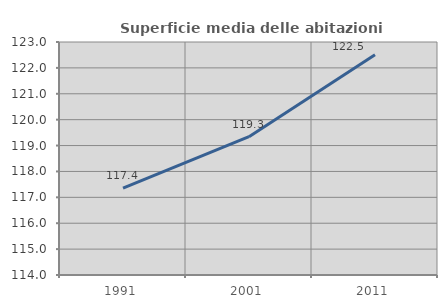
| Category | Superficie media delle abitazioni occupate |
|---|---|
| 1991.0 | 117.356 |
| 2001.0 | 119.341 |
| 2011.0 | 122.505 |